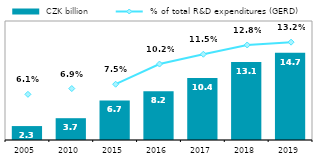
| Category |  CZK billion |
|---|---|
| 2005.0 | 2.342 |
| 2010.0 | 3.664 |
| 2015.0 | 6.651 |
| 2016.0 | 8.182 |
| 2017.0 | 10.424 |
| 2018.0 | 13.125 |
| 2019.0 | 14.683 |